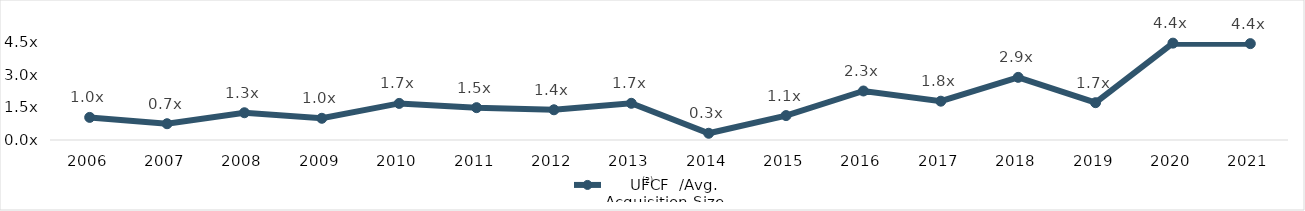
| Category |      UFCF  /Avg. Acquisition Size |
|---|---|
| 2006.0 | 1.038 |
| 2007.0 | 0.747 |
| 2008.0 | 1.251 |
| 2009.0 | 0.997 |
| 2010.0 | 1.68 |
| 2011.0 | 1.485 |
| 2012.0 | 1.388 |
| 2013.0 | 1.686 |
| 2014.0 | 0.31 |
| 2015.0 | 1.122 |
| 2016.0 | 2.25 |
| 2017.0 | 1.782 |
| 2018.0 | 2.877 |
| 2019.0 | 1.713 |
| 2020.0 | 4.448 |
| 2021.0 | 4.425 |